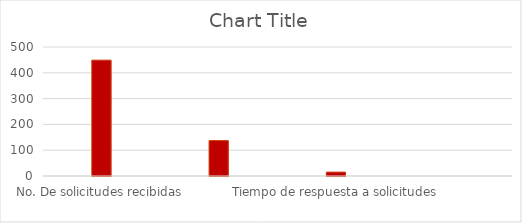
| Category | Series 0 |
|---|---|
| No. De solicitudes recibidas | 449 |
| No. De solicitudes trasladadas a otra entidad | 137 |
| Tiempo de respuesta a solicitudes | 15 |
| No. De Solicitudes en las que se negó el acceso a la información  | 0 |